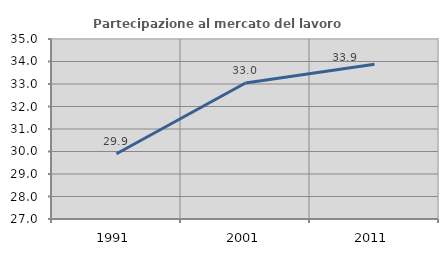
| Category | Partecipazione al mercato del lavoro  femminile |
|---|---|
| 1991.0 | 29.898 |
| 2001.0 | 33.046 |
| 2011.0 | 33.879 |